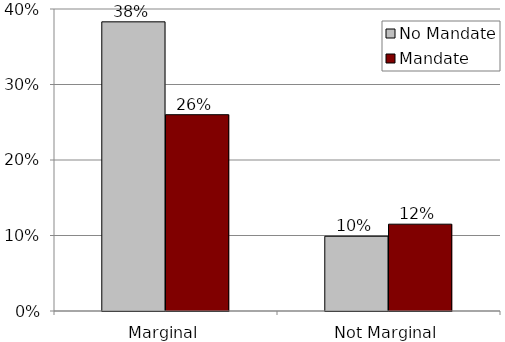
| Category | No Mandate | Mandate |
|---|---|---|
| Marginal | 0.383 | 0.26 |
| Not Marginal | 0.099 | 0.115 |